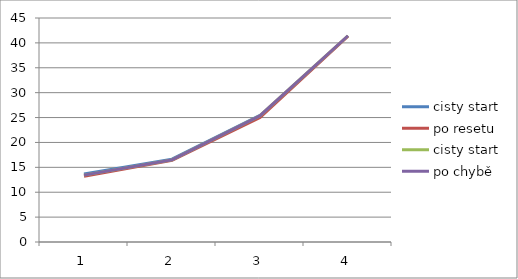
| Category | cisty start | po resetu | po chybě |
|---|---|---|---|
| 0 | 13.433 | 13.2 | 13.433 |
| 1 | 16.5 | 16.4 | 16.5 |
| 2 | 25.367 | 25.033 | 25.367 |
| 3 | 41.433 | 41.367 | 41.433 |